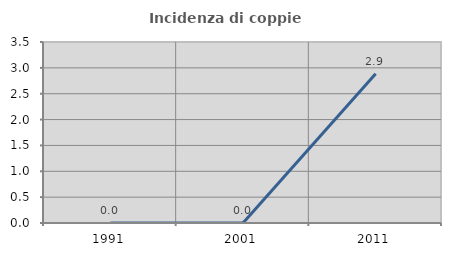
| Category | Incidenza di coppie miste |
|---|---|
| 1991.0 | 0 |
| 2001.0 | 0 |
| 2011.0 | 2.885 |